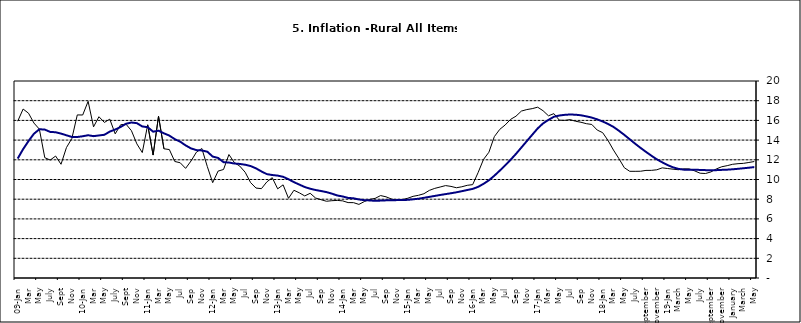
| Category | Series 0 | Series 1 |
|---|---|---|
| 09-Jan | 15.918 | 12.128 |
| Feb | 17.154 | 13.086 |
| Mar | 16.729 | 13.912 |
| Apr | 15.727 | 14.644 |
| May | 15.113 | 15.104 |
| June | 12.213 | 15.067 |
| July | 11.974 | 14.832 |
| Aug | 12.38 | 14.796 |
| Sept | 11.548 | 14.661 |
| Oct | 13.242 | 14.488 |
| Nov | 14.164 | 14.321 |
|  | 16.557 | 14.316 |
| 10-Jan | 16.548 | 14.39 |
| Feb | 17.934 | 14.494 |
| Mar | 15.346 | 14.401 |
| Apr | 16.373 | 14.473 |
| May | 15.794 | 14.54 |
| June | 16.126 | 14.862 |
| July | 14.634 | 15.072 |
| Aug | 15.556 | 15.33 |
| Sept | 15.616 | 15.658 |
| Oct | 14.955 | 15.786 |
| Nov | 13.616 | 15.719 |
| Dec | 12.735 | 15.385 |
| 11-Jan | 15.553 | 15.311 |
| Feb | 12.482 | 14.856 |
| Mar | 16.422 | 14.956 |
| Apr | 13.117 | 14.687 |
| May | 13.041 | 14.457 |
| Jun | 11.83 | 14.095 |
| Jul | 11.699 | 13.84 |
| Aug | 11.13 | 13.464 |
| Sep | 11.878 | 13.156 |
| Oct | 12.778 | 12.985 |
| Nov | 13.147 | 12.95 |
| Dec | 11.326 | 12.824 |
| 12-Jan | 9.678 | 12.33 |
| Feb | 10.856 | 12.188 |
| Mar | 11.014 | 11.76 |
| Apr | 12.536 | 11.724 |
| May | 11.712 | 11.621 |
| Jun | 11.36 | 11.582 |
| Jul | 10.733 | 11.499 |
| Aug | 9.683 | 11.368 |
| Sep | 9.132 | 11.131 |
| Oct | 9.071 | 10.82 |
| Nov | 9.758 | 10.548 |
| Dec | 10.183 | 10.455 |
| 13-Jan | 9.052 | 10.394 |
| Feb | 9.457 | 10.276 |
| Mar | 8.091 | 10.025 |
| Apr | 8.907 | 9.732 |
| May | 8.647 | 9.483 |
| Jun | 8.333 | 9.236 |
| Jul | 8.6 | 9.063 |
| Aug | 8.12 | 8.933 |
| Sep | 7.95 | 8.832 |
| Oct | 7.791 | 8.722 |
| Nov | 7.849 | 8.565 |
| Dec | 7.879 | 8.378 |
| 14-Jan | 7.832 | 8.277 |
| Feb | 7.657 | 8.13 |
| Mar | 7.65 | 8.092 |
| Apr | 7.473 | 7.973 |
| May | 7.761 | 7.901 |
| Jun | 7.98 | 7.874 |
| Jul | 8.086 | 7.834 |
| Aug | 8.368 | 7.858 |
| Sep | 8.244 | 7.883 |
| Oct | 8.019 | 7.903 |
| Nov | 7.898 | 7.906 |
| Dec | 7.955 | 7.913 |
| 15-Jan | 8.094 | 7.935 |
| Feb | 8.291 | 7.988 |
| Mar | 8.396 | 8.05 |
| Apr | 8.556 | 8.14 |
| May | 8.896 | 8.236 |
| Jun | 9.098 | 8.331 |
| Jul | 9.238 | 8.429 |
| Aug | 9.382 | 8.516 |
| Sep | 9.3 | 8.606 |
| Oct | 9.162 | 8.7 |
| Nov | 9.261 | 8.813 |
| Dec | 9.41 | 8.933 |
| 16-Jan | 9.48 | 9.047 |
| Feb | 10.692 | 9.249 |
| Mar | 12.038 | 9.559 |
| Apr | 12.767 | 9.917 |
| May | 14.349 | 10.384 |
| Jun | 15.088 | 10.897 |
| Jul | 15.533 | 11.433 |
| Aug | 16.103 | 12.002 |
| Sep | 16.428 | 12.601 |
| Oct | 16.947 | 13.25 |
| Nov | 17.099 | 13.898 |
| Dec | 17.195 | 14.54 |
| 17-Jan | 17.341 | 15.183 |
| Feb | 16.982 | 15.696 |
| Mar | 16.466 | 16.054 |
| Apr | 16.687 | 16.369 |
| May | 16.023 | 16.497 |
| Jun | 16.007 | 16.563 |
| Jul | 16.078 | 16.6 |
| Aug | 15.914 | 16.577 |
| Sep | 15.812 | 16.52 |
| Oct | 15.666 | 16.411 |
| Nov | 15.587 | 16.285 |
| Dec | 15.018 | 16.104 |
| 18-Jan | 14.756 | 15.892 |
| Feb | 13.957 | 15.638 |
| Mar | 12.987 | 15.339 |
| Apr | 12.126 | 14.95 |
| May | 11.199 | 14.53 |
| June | 10.832 | 14.083 |
| July | 10.831 | 13.636 |
| August | 10.838 | 13.209 |
| September | 10.924 | 12.804 |
| October | 10.927 | 12.418 |
| November | 10.986 | 12.049 |
| December | 11.183 | 11.746 |
| 19-Jan | 11.115 | 11.462 |
| February | 11.048 | 11.234 |
| March | 10.99 | 11.078 |
| April | 11.08 | 10.997 |
| May | 11.075 | 10.988 |
| June | 10.874 | 10.99 |
| July | 10.636 | 10.972 |
| August | 10.609 | 10.951 |
| September | 10.771 | 10.937 |
| October | 11.074 | 10.95 |
| November | 11.296 | 10.977 |
| December | 11.406 | 10.998 |
| January | 11.543 | 11.037 |
| February | 11.606 | 11.086 |
| March | 11.639 | 11.141 |
| April | 11.728 | 11.197 |
| May | 11.826 | 11.261 |